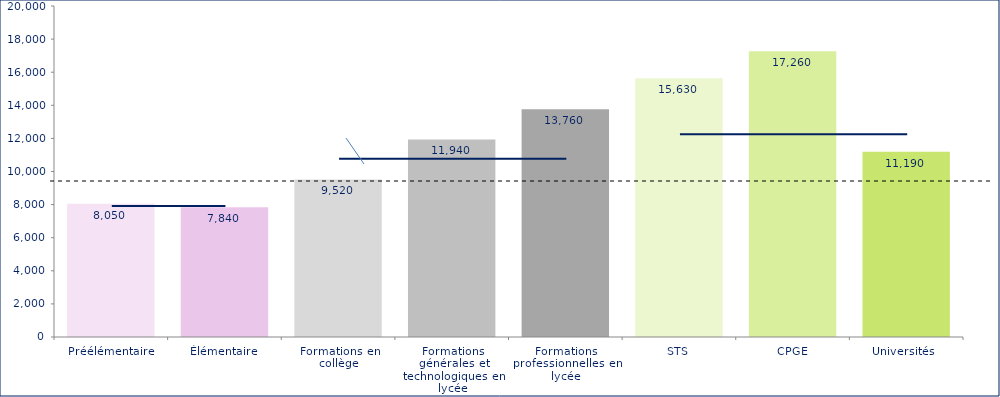
| Category | Series 0 |
|---|---|
| Préélémentaire | 8050 |
| Élémentaire | 7840 |
| Formations en collège | 9520 |
| Formations générales et technologiques en lycée | 11940 |
| Formations professionnelles en lycée | 13760 |
| STS | 15630 |
| CPGE | 17260 |
| Universités  | 11190 |